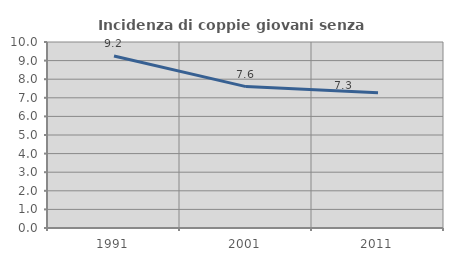
| Category | Incidenza di coppie giovani senza figli |
|---|---|
| 1991.0 | 9.244 |
| 2001.0 | 7.602 |
| 2011.0 | 7.275 |